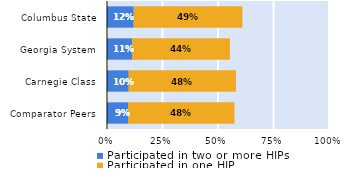
| Category | Participated in two or more HIPs | Participated in one HIP |
|---|---|---|
| Comparator Peers | 0.095 | 0.479 |
| Carnegie Class | 0.098 | 0.483 |
| Georgia System | 0.113 | 0.44 |
| Columbus State | 0.121 | 0.489 |